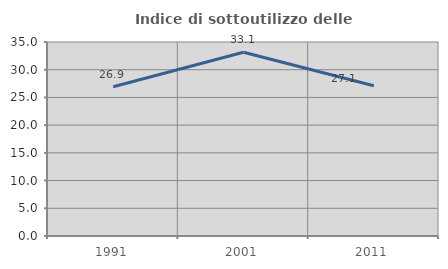
| Category | Indice di sottoutilizzo delle abitazioni  |
|---|---|
| 1991.0 | 26.923 |
| 2001.0 | 33.141 |
| 2011.0 | 27.113 |